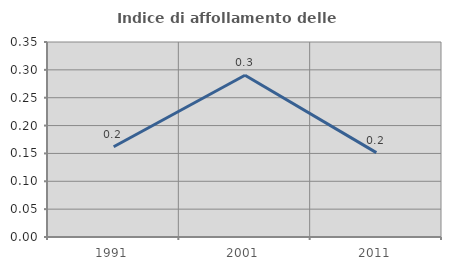
| Category | Indice di affollamento delle abitazioni  |
|---|---|
| 1991.0 | 0.162 |
| 2001.0 | 0.29 |
| 2011.0 | 0.152 |